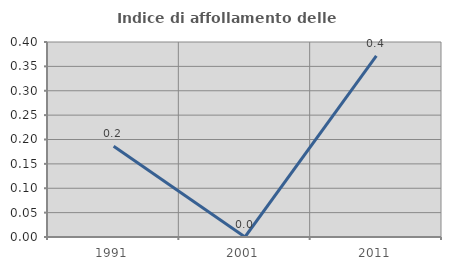
| Category | Indice di affollamento delle abitazioni  |
|---|---|
| 1991.0 | 0.186 |
| 2001.0 | 0 |
| 2011.0 | 0.372 |